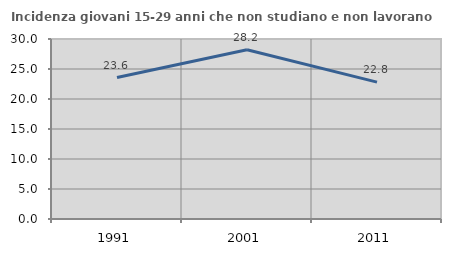
| Category | Incidenza giovani 15-29 anni che non studiano e non lavorano  |
|---|---|
| 1991.0 | 23.577 |
| 2001.0 | 28.203 |
| 2011.0 | 22.809 |